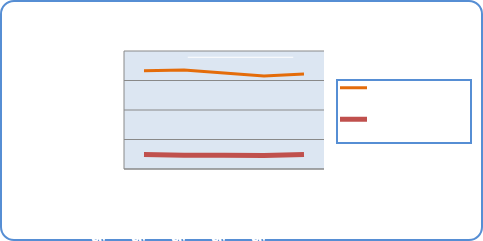
| Category | Motorin Türleri  | Benzin Türleri |
|---|---|---|
| 9/3/18 | 66557960.172 | 9751419.637 |
| 9/4/18 | 67057192.755 | 9385272.074 |
| 9/5/18 | 65006002.604 | 9324265.797 |
| 9/6/18 | 63094171.352 | 9095560.14 |
| 9/7/18 | 64418365.628 | 9912872.315 |